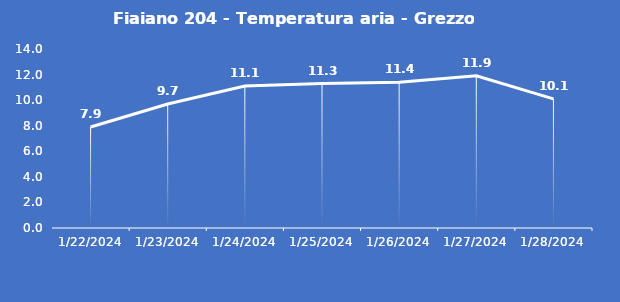
| Category | Fiaiano 204 - Temperatura aria - Grezzo (°C) |
|---|---|
| 1/22/24 | 7.9 |
| 1/23/24 | 9.7 |
| 1/24/24 | 11.1 |
| 1/25/24 | 11.3 |
| 1/26/24 | 11.4 |
| 1/27/24 | 11.9 |
| 1/28/24 | 10.1 |